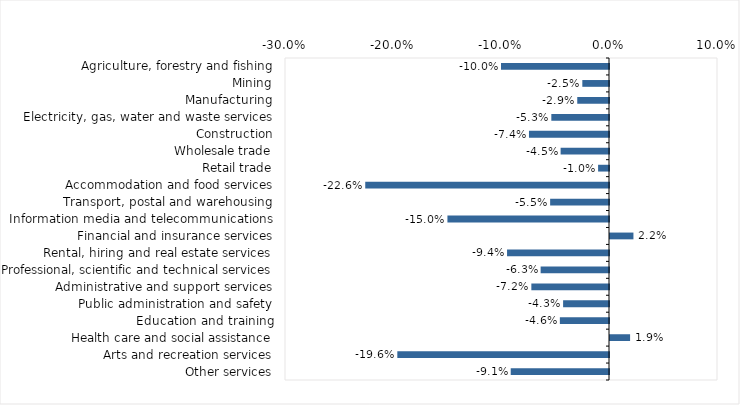
| Category | This week |
|---|---|
| Agriculture, forestry and fishing | -0.1 |
| Mining | -0.025 |
| Manufacturing | -0.029 |
| Electricity, gas, water and waste services | -0.053 |
| Construction | -0.074 |
| Wholesale trade | -0.045 |
| Retail trade | -0.01 |
| Accommodation and food services | -0.226 |
| Transport, postal and warehousing | -0.054 |
| Information media and telecommunications | -0.15 |
| Financial and insurance services | 0.022 |
| Rental, hiring and real estate services | -0.094 |
| Professional, scientific and technical services | -0.063 |
| Administrative and support services | -0.072 |
| Public administration and safety | -0.042 |
| Education and training | -0.046 |
| Health care and social assistance | 0.019 |
| Arts and recreation services | -0.196 |
| Other services | -0.091 |